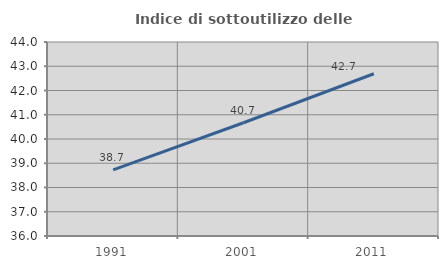
| Category | Indice di sottoutilizzo delle abitazioni  |
|---|---|
| 1991.0 | 38.73 |
| 2001.0 | 40.671 |
| 2011.0 | 42.691 |